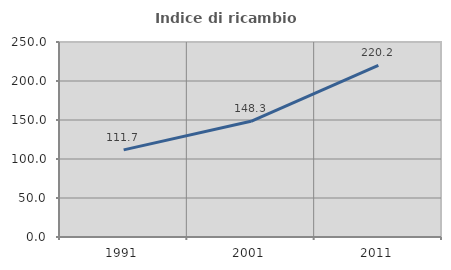
| Category | Indice di ricambio occupazionale  |
|---|---|
| 1991.0 | 111.719 |
| 2001.0 | 148.306 |
| 2011.0 | 220.164 |